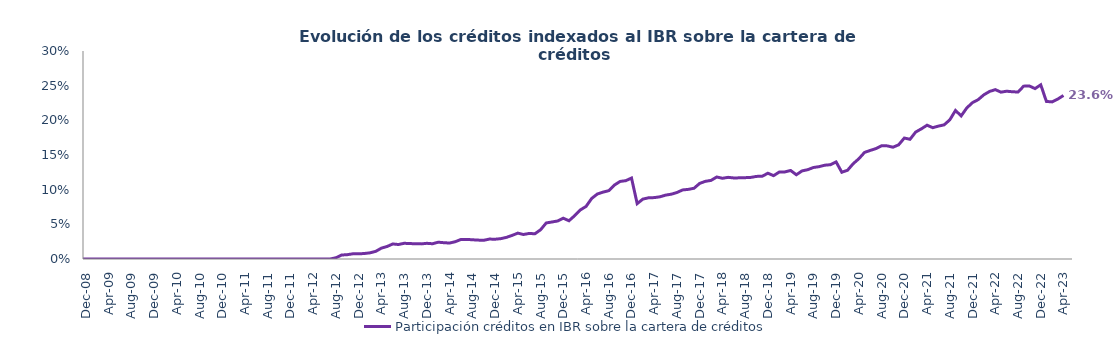
| Category | Participación créditos en IBR sobre la cartera de créditos |
|---|---|
| 2008-07-01 | 0 |
| 2008-08-01 | 0 |
| 2008-09-01 | 0 |
| 2008-10-01 | 0 |
| 2008-11-01 | 0 |
| 2008-12-01 | 0 |
| 2009-01-01 | 0 |
| 2009-02-01 | 0 |
| 2009-03-01 | 0 |
| 2009-04-01 | 0 |
| 2009-05-01 | 0 |
| 2009-06-01 | 0 |
| 2009-07-01 | 0 |
| 2009-08-01 | 0 |
| 2009-09-01 | 0 |
| 2009-10-01 | 0 |
| 2009-11-01 | 0 |
| 2009-12-01 | 0 |
| 2010-01-01 | 0 |
| 2010-02-01 | 0 |
| 2010-03-01 | 0 |
| 2010-04-01 | 0 |
| 2010-05-01 | 0 |
| 2010-06-01 | 0 |
| 2010-07-01 | 0 |
| 2010-08-01 | 0 |
| 2010-09-01 | 0 |
| 2010-10-01 | 0 |
| 2010-11-01 | 0 |
| 2010-12-01 | 0 |
| 2011-01-01 | 0 |
| 2011-02-01 | 0 |
| 2011-03-01 | 0 |
| 2011-04-01 | 0 |
| 2011-05-01 | 0 |
| 2011-06-01 | 0 |
| 2011-07-01 | 0 |
| 2011-08-01 | 0 |
| 2011-09-01 | 0 |
| 2011-10-01 | 0 |
| 2011-11-01 | 0 |
| 2011-12-01 | 0 |
| 2012-01-01 | 0 |
| 2012-02-01 | 0 |
| 2012-03-01 | 0 |
| 2012-04-01 | 0 |
| 2012-05-01 | 0 |
| 2012-06-01 | 0 |
| 2012-07-01 | 0 |
| 2012-08-01 | 0.002 |
| 2012-09-01 | 0.006 |
| 2012-10-01 | 0.006 |
| 2012-11-01 | 0.008 |
| 2012-12-01 | 0.007 |
| 2013-01-01 | 0.008 |
| 2013-02-01 | 0.009 |
| 2013-03-01 | 0.011 |
| 2013-04-01 | 0.016 |
| 2013-05-01 | 0.018 |
| 2013-06-01 | 0.022 |
| 2013-07-01 | 0.021 |
| 2013-08-01 | 0.023 |
| 2013-09-01 | 0.022 |
| 2013-10-01 | 0.022 |
| 2013-11-01 | 0.022 |
| 2013-12-01 | 0.023 |
| 2014-01-01 | 0.022 |
| 2014-02-01 | 0.024 |
| 2014-03-01 | 0.024 |
| 2014-04-01 | 0.023 |
| 2014-05-01 | 0.025 |
| 2014-06-01 | 0.028 |
| 2014-07-01 | 0.028 |
| 2014-08-01 | 0.028 |
| 2014-09-01 | 0.027 |
| 2014-10-01 | 0.027 |
| 2014-11-01 | 0.029 |
| 2014-12-01 | 0.029 |
| 2015-01-01 | 0.029 |
| 2015-02-01 | 0.031 |
| 2015-03-01 | 0.034 |
| 2015-04-01 | 0.037 |
| 2015-05-01 | 0.035 |
| 2015-06-01 | 0.037 |
| 2015-07-01 | 0.036 |
| 2015-08-01 | 0.042 |
| 2015-09-01 | 0.052 |
| 2015-10-01 | 0.053 |
| 2015-11-01 | 0.055 |
| 2015-12-01 | 0.059 |
| 2016-01-01 | 0.055 |
| 2016-02-01 | 0.062 |
| 2016-03-01 | 0.071 |
| 2016-04-01 | 0.076 |
| 2016-05-01 | 0.087 |
| 2016-06-01 | 0.094 |
| 2016-07-01 | 0.096 |
| 2016-08-01 | 0.099 |
| 2016-09-01 | 0.107 |
| 2016-10-01 | 0.112 |
| 2016-11-01 | 0.113 |
| 2016-12-01 | 0.117 |
| 2017-01-01 | 0.08 |
| 2017-02-01 | 0.086 |
| 2017-03-01 | 0.088 |
| 2017-04-01 | 0.089 |
| 2017-05-01 | 0.09 |
| 2017-06-01 | 0.092 |
| 2017-07-01 | 0.093 |
| 2017-08-01 | 0.096 |
| 2017-09-01 | 0.1 |
| 2017-10-01 | 0.1 |
| 2017-11-01 | 0.102 |
| 2017-12-01 | 0.109 |
| 2018-01-01 | 0.112 |
| 2018-02-01 | 0.113 |
| 2018-03-01 | 0.118 |
| 2018-04-01 | 0.116 |
| 2018-05-01 | 0.118 |
| 2018-06-01 | 0.117 |
| 2018-07-01 | 0.117 |
| 2018-08-01 | 0.117 |
| 2018-09-01 | 0.118 |
| 2018-10-01 | 0.119 |
| 2018-11-01 | 0.119 |
| 2018-12-01 | 0.124 |
| 2019-01-01 | 0.12 |
| 2019-02-01 | 0.125 |
| 2019-03-01 | 0.126 |
| 2019-04-01 | 0.128 |
| 2019-05-01 | 0.122 |
| 2019-06-01 | 0.127 |
| 2019-07-01 | 0.129 |
| 2019-08-01 | 0.132 |
| 2019-09-01 | 0.133 |
| 2019-10-01 | 0.135 |
| 2019-11-01 | 0.136 |
| 2019-12-01 | 0.14 |
| 2020-01-01 | 0.125 |
| 2020-02-01 | 0.128 |
| 2020-03-01 | 0.137 |
| 2020-04-01 | 0.145 |
| 2020-05-01 | 0.154 |
| 2020-06-01 | 0.157 |
| 2020-07-01 | 0.159 |
| 2020-08-01 | 0.163 |
| 2020-09-01 | 0.163 |
| 2020-10-01 | 0.161 |
| 2020-11-01 | 0.165 |
| 2020-12-01 | 0.174 |
| 2021-01-01 | 0.173 |
| 2021-02-01 | 0.183 |
| 2021-03-01 | 0.188 |
| 2021-04-01 | 0.193 |
| 2021-05-01 | 0.189 |
| 2021-06-01 | 0.192 |
| 2021-07-01 | 0.193 |
| 2021-08-01 | 0.201 |
| 2021-09-01 | 0.214 |
| 2021-10-01 | 0.206 |
| 2021-11-01 | 0.218 |
| 2021-12-01 | 0.226 |
| 2022-01-01 | 0.23 |
| 2022-02-01 | 0.237 |
| 2022-03-01 | 0.242 |
| 2022-04-01 | 0.244 |
| 2022-05-01 | 0.241 |
| 2022-06-01 | 0.242 |
| 2022-07-01 | 0.241 |
| 2022-08-01 | 0.241 |
| 2022-09-01 | 0.249 |
| 2022-10-01 | 0.25 |
| 2022-11-01 | 0.246 |
| 2022-12-01 | 0.251 |
| 2023-01-01 | 0.227 |
| 2023-02-01 | 0.227 |
| 2023-03-01 | 0.231 |
| 2023-04-01 | 0.236 |